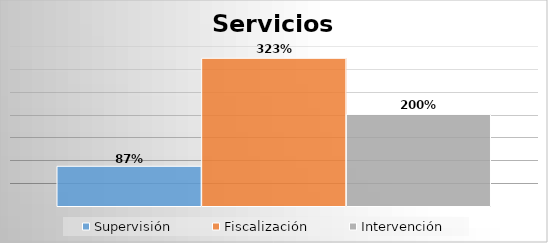
| Category | Supervisión | Fiscalización | Intervención |
|---|---|---|---|
| 0 | 0.869 | 3.231 | 2 |